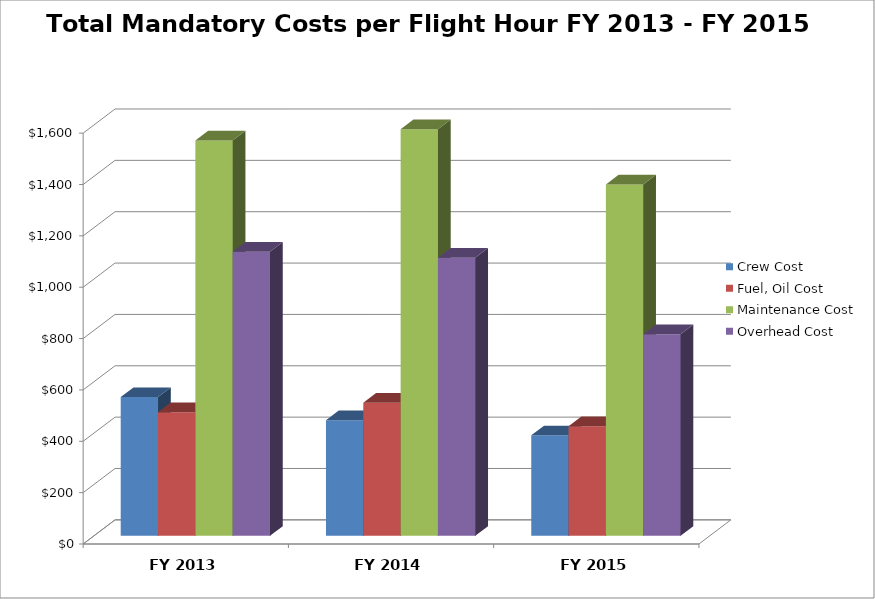
| Category | Crew Cost | Fuel, Oil Cost | Maintenance Cost | Overhead Cost |
|---|---|---|---|---|
| FY 2013 | 540.415 | 481.485 | 1539.68 | 1106.212 |
| FY 2014 | 450.447 | 518.628 | 1583.729 | 1082.872 |
| FY 2015 | 391.212 | 426.985 | 1368.314 | 785.498 |